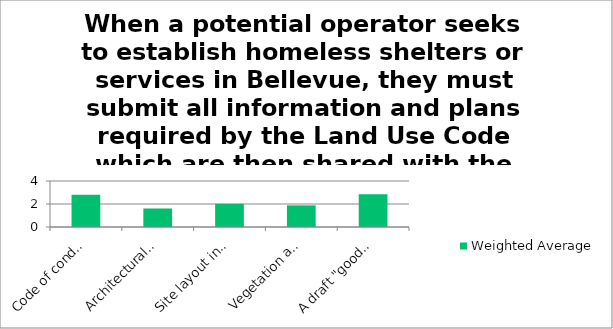
| Category | Weighted Average |
|---|---|
| Code of conduct for shelter residents | 2.81 |
| Architectural drawings of exterior | 1.61 |
| Site layout including parking | 2.01 |
| Vegetation and screening plans | 1.88 |
| A draft "good neighbor" plan which would address public safety and operating protocols | 2.85 |